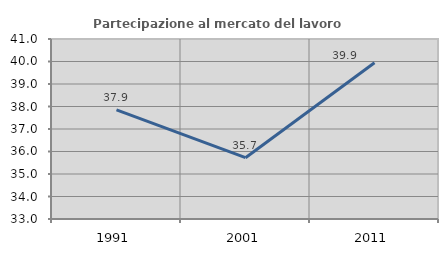
| Category | Partecipazione al mercato del lavoro  femminile |
|---|---|
| 1991.0 | 37.853 |
| 2001.0 | 35.725 |
| 2011.0 | 39.943 |